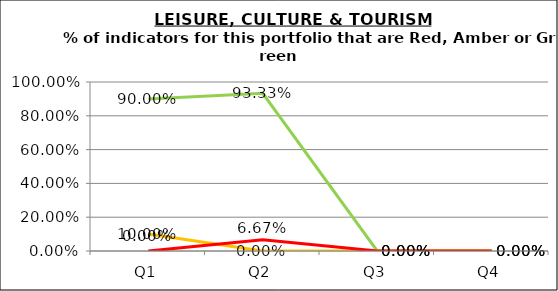
| Category | Green | Amber | Red |
|---|---|---|---|
| Q1 | 0.9 | 0.1 | 0 |
| Q2 | 0.933 | 0 | 0.067 |
| Q3 | 0 | 0 | 0 |
| Q4 | 0 | 0 | 0 |